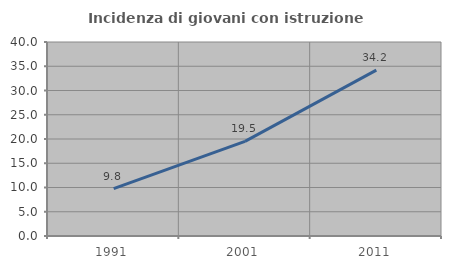
| Category | Incidenza di giovani con istruzione universitaria |
|---|---|
| 1991.0 | 9.774 |
| 2001.0 | 19.497 |
| 2011.0 | 34.211 |